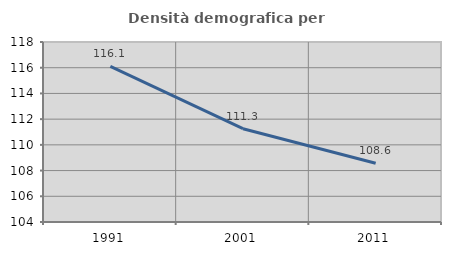
| Category | Densità demografica |
|---|---|
| 1991.0 | 116.105 |
| 2001.0 | 111.258 |
| 2011.0 | 108.566 |